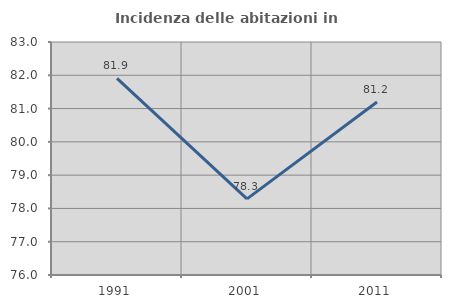
| Category | Incidenza delle abitazioni in proprietà  |
|---|---|
| 1991.0 | 81.905 |
| 2001.0 | 78.287 |
| 2011.0 | 81.198 |